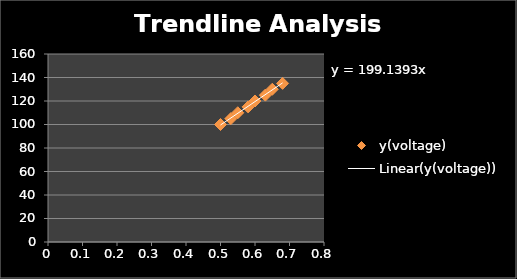
| Category | y(voltage) |
|---|---|
| 0.5 | 100 |
| 0.53 | 105 |
| 0.55 | 110 |
| 0.58 | 115 |
| 0.6 | 120 |
| 0.63 | 125 |
| 0.65 | 130 |
| 0.68 | 135 |